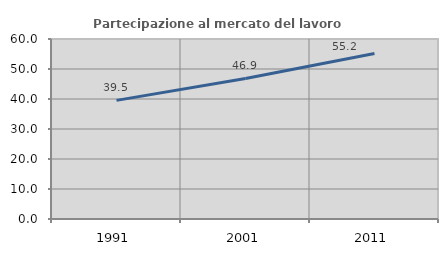
| Category | Partecipazione al mercato del lavoro  femminile |
|---|---|
| 1991.0 | 39.547 |
| 2001.0 | 46.863 |
| 2011.0 | 55.168 |